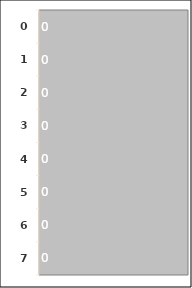
| Category | Series 0 |
|---|---|
| 0.0 | 0 |
| 1.0 | 0 |
| 2.0 | 0 |
| 3.0 | 0 |
| 4.0 | 0 |
| 5.0 | 0 |
| 6.0 | 0 |
| 7.0 | 0 |